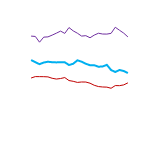
| Category | Online | Store | Phone |
|---|---|---|---|
| 0 | 8933 | 6635 | 4903 |
| 1 | 8899 | 6427 | 5038 |
| 2 | 8347 | 6233 | 5035 |
| 3 | 8834 | 6392 | 5031 |
| 4 | 8857 | 6469 | 5011 |
| 5 | 9026 | 6422 | 4877 |
| 6 | 9213 | 6404 | 4802 |
| 7 | 9414 | 6426 | 4854 |
| 8 | 9193 | 6415 | 4946 |
| 9 | 9754 | 6152 | 4658 |
| 10 | 9436 | 6273 | 4586 |
| 11 | 9211 | 6603 | 4480 |
| 12 | 8934 | 6471 | 4520 |
| 13 | 8974 | 6272 | 4516 |
| 14 | 8774 | 6132 | 4405 |
| 15 | 9027 | 6133 | 4205 |
| 16 | 9208 | 5988 | 4082 |
| 17 | 9133 | 6013 | 4039 |
| 18 | 9127 | 6169 | 4025 |
| 19 | 9196 | 5673 | 3918 |
| 20 | 9784 | 5478 | 4174 |
| 21 | 9496 | 5676 | 4167 |
| 22 | 9220 | 5576 | 4241 |
| 23 | 8855 | 5377 | 4437 |